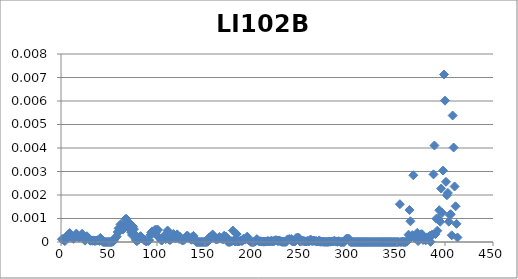
| Category |  LI102B |
|---|---|
| 0 | 0 |
| 1 | 0 |
| 2 | 0 |
| 3 | 0 |
| 4 | 0 |
| 5 | 0 |
| 6 | 0 |
| 7 | 0 |
| 8 | 0 |
| 9 | 0 |
| 10 | 0 |
| 11 | 0 |
| 12 | 0 |
| 13 | 0 |
| 14 | 0 |
| 15 | 0 |
| 16 | 0 |
| 17 | 0 |
| 18 | 0 |
| 19 | 0 |
| 20 | 0 |
| 21 | 0 |
| 22 | 0 |
| 23 | 0 |
| 24 | 0 |
| 25 | 0 |
| 26 | 0 |
| 27 | 0 |
| 28 | 0 |
| 29 | 0 |
| 30 | 0 |
| 31 | 0 |
| 32 | 0 |
| 33 | 0 |
| 34 | 0 |
| 35 | 0 |
| 36 | 0 |
| 37 | 0 |
| 38 | 0 |
| 39 | 0 |
| 40 | 0 |
| 41 | 0 |
| 42 | 0 |
| 43 | 0 |
| 44 | 0 |
| 45 | 0 |
| 46 | 0 |
| 47 | 0 |
| 48 | 0 |
| 49 | 0 |
| 50 | 0 |
| 51 | 0 |
| 52 | 0 |
| 53 | 0 |
| 54 | 0 |
| 55 | 0 |
| 56 | 0 |
| 57 | 0 |
| 58 | 0 |
| 59 | 0.001 |
| 60 | 0 |
| 61 | 0.001 |
| 62 | 0.001 |
| 63 | 0.001 |
| 64 | 0.001 |
| 65 | 0.001 |
| 66 | 0.001 |
| 67 | 0.001 |
| 68 | 0.001 |
| 69 | 0.001 |
| 70 | 0.001 |
| 71 | 0.001 |
| 72 | 0 |
| 73 | 0 |
| 74 | 0.001 |
| 75 | 0.001 |
| 76 | 0 |
| 77 | 0 |
| 78 | 0 |
| 79 | 0 |
| 80 | 0 |
| 81 | 0 |
| 82 | 0 |
| 83 | 0 |
| 84 | 0 |
| 85 | 0 |
| 86 | 0 |
| 87 | 0 |
| 88 | 0 |
| 89 | 0 |
| 90 | 0 |
| 91 | 0 |
| 92 | 0 |
| 93 | 0 |
| 94 | 0 |
| 95 | 0 |
| 96 | 0 |
| 97 | 0.001 |
| 98 | 0 |
| 99 | 0.001 |
| 100 | 0.001 |
| 101 | 0 |
| 102 | 0 |
| 103 | 0 |
| 104 | 0 |
| 105 | 0 |
| 106 | 0 |
| 107 | 0 |
| 108 | 0 |
| 109 | 0 |
| 110 | 0 |
| 111 | 0 |
| 112 | 0 |
| 113 | 0 |
| 114 | 0 |
| 115 | 0 |
| 116 | 0 |
| 117 | 0 |
| 118 | 0 |
| 119 | 0 |
| 120 | 0 |
| 121 | 0 |
| 122 | 0 |
| 123 | 0 |
| 124 | 0 |
| 125 | 0 |
| 126 | 0 |
| 127 | 0 |
| 128 | 0 |
| 129 | 0 |
| 130 | 0 |
| 131 | 0 |
| 132 | 0 |
| 133 | 0 |
| 134 | 0 |
| 135 | 0 |
| 136 | 0 |
| 137 | 0 |
| 138 | 0 |
| 139 | 0 |
| 140 | 0 |
| 141 | 0 |
| 142 | 0 |
| 143 | 0 |
| 144 | 0 |
| 145 | 0 |
| 146 | 0 |
| 147 | 0 |
| 148 | 0 |
| 149 | 0 |
| 150 | 0 |
| 151 | 0 |
| 152 | 0 |
| 153 | 0 |
| 154 | 0 |
| 155 | 0 |
| 156 | 0 |
| 157 | 0 |
| 158 | 0 |
| 159 | 0 |
| 160 | 0 |
| 161 | 0 |
| 162 | 0 |
| 163 | 0 |
| 164 | 0 |
| 165 | 0 |
| 166 | 0 |
| 167 | 0 |
| 168 | 0 |
| 169 | 0 |
| 170 | 0 |
| 171 | 0 |
| 172 | 0 |
| 173 | 0 |
| 174 | 0 |
| 175 | 0 |
| 176 | 0 |
| 177 | 0 |
| 178 | 0 |
| 179 | 0 |
| 180 | 0 |
| 181 | 0 |
| 182 | 0 |
| 183 | 0 |
| 184 | 0 |
| 185 | 0 |
| 186 | 0 |
| 187 | 0 |
| 188 | 0 |
| 189 | 0 |
| 190 | 0 |
| 191 | 0 |
| 192 | 0 |
| 193 | 0 |
| 194 | 0 |
| 195 | 0 |
| 196 | 0 |
| 197 | 0 |
| 198 | 0 |
| 199 | 0 |
| 200 | 0 |
| 201 | 0 |
| 202 | 0 |
| 203 | 0 |
| 204 | 0 |
| 205 | 0 |
| 206 | 0 |
| 207 | 0 |
| 208 | 0 |
| 209 | 0 |
| 210 | 0 |
| 211 | 0 |
| 212 | 0 |
| 213 | 0 |
| 214 | 0 |
| 215 | 0 |
| 216 | 0 |
| 217 | 0 |
| 218 | 0 |
| 219 | 0 |
| 220 | 0 |
| 221 | 0 |
| 222 | 0 |
| 223 | 0 |
| 224 | 0 |
| 225 | 0 |
| 226 | 0 |
| 227 | 0 |
| 228 | 0 |
| 229 | 0 |
| 230 | 0 |
| 231 | 0 |
| 232 | 0 |
| 233 | 0 |
| 234 | 0 |
| 235 | 0 |
| 236 | 0 |
| 237 | 0 |
| 238 | 0 |
| 239 | 0 |
| 240 | 0 |
| 241 | 0 |
| 242 | 0 |
| 243 | 0 |
| 244 | 0 |
| 245 | 0 |
| 246 | 0 |
| 247 | 0 |
| 248 | 0 |
| 249 | 0 |
| 250 | 0 |
| 251 | 0 |
| 252 | 0 |
| 253 | 0 |
| 254 | 0 |
| 255 | 0 |
| 256 | 0 |
| 257 | 0 |
| 258 | 0 |
| 259 | 0 |
| 260 | 0 |
| 261 | 0 |
| 262 | 0 |
| 263 | 0 |
| 264 | 0 |
| 265 | 0 |
| 266 | 0 |
| 267 | 0 |
| 268 | 0 |
| 269 | 0 |
| 270 | 0 |
| 271 | 0 |
| 272 | 0 |
| 273 | 0 |
| 274 | 0 |
| 275 | 0 |
| 276 | 0 |
| 277 | 0 |
| 278 | 0 |
| 279 | 0 |
| 280 | 0 |
| 281 | 0 |
| 282 | 0 |
| 283 | 0 |
| 284 | 0 |
| 285 | 0 |
| 286 | 0 |
| 287 | 0 |
| 288 | 0 |
| 289 | 0 |
| 290 | 0 |
| 291 | 0 |
| 292 | 0 |
| 293 | 0 |
| 294 | 0 |
| 295 | 0 |
| 296 | 0 |
| 297 | 0 |
| 298 | 0 |
| 299 | 0 |
| 300 | 0 |
| 301 | 0 |
| 302 | 0 |
| 303 | 0 |
| 304 | 0 |
| 305 | 0 |
| 306 | 0 |
| 307 | 0 |
| 308 | 0 |
| 309 | 0 |
| 310 | 0 |
| 311 | 0 |
| 312 | 0 |
| 313 | 0 |
| 314 | 0 |
| 315 | 0 |
| 316 | 0 |
| 317 | 0 |
| 318 | 0 |
| 319 | 0 |
| 320 | 0 |
| 321 | 0 |
| 322 | 0 |
| 323 | 0 |
| 324 | 0 |
| 325 | 0 |
| 326 | 0 |
| 327 | 0 |
| 328 | 0 |
| 329 | 0 |
| 330 | 0 |
| 331 | 0 |
| 332 | 0 |
| 333 | 0 |
| 334 | 0 |
| 335 | 0 |
| 336 | 0 |
| 337 | 0 |
| 338 | 0 |
| 339 | 0 |
| 340 | 0 |
| 341 | 0 |
| 342 | 0 |
| 343 | 0 |
| 344 | 0 |
| 345 | 0 |
| 346 | 0 |
| 347 | 0 |
| 348 | 0 |
| 349 | 0 |
| 350 | 0 |
| 351 | 0 |
| 352 | 0.002 |
| 353 | 0 |
| 354 | 0 |
| 355 | 0 |
| 356 | 0 |
| 357 | 0 |
| 358 | 0 |
| 359 | 0 |
| 360 | 0 |
| 361 | 0 |
| 362 | 0.001 |
| 363 | 0.001 |
| 364 | 0 |
| 365 | 0 |
| 366 | 0.003 |
| 367 | 0 |
| 368 | 0 |
| 369 | 0 |
| 370 | 0 |
| 371 | 0 |
| 372 | 0 |
| 373 | 0 |
| 374 | 0 |
| 375 | 0 |
| 376 | 0 |
| 377 | 0 |
| 378 | 0 |
| 379 | 0 |
| 380 | 0 |
| 381 | 0 |
| 382 | 0 |
| 383 | 0 |
| 384 | 0 |
| 385 | 0 |
| 386 | 0 |
| 387 | 0.003 |
| 388 | 0.004 |
| 389 | 0 |
| 390 | 0.001 |
| 391 | 0 |
| 392 | 0.001 |
| 393 | 0.001 |
| 394 | 0.001 |
| 395 | 0.002 |
| 396 | 0.001 |
| 397 | 0.003 |
| 398 | 0.007 |
| 399 | 0.006 |
| 400 | 0.003 |
| 401 | 0.002 |
| 402 | 0.002 |
| 403 | 0.001 |
| 404 | 0.001 |
| 405 | 0.001 |
| 406 | 0 |
| 407 | 0.005 |
| 408 | 0.004 |
| 409 | 0.002 |
| 410 | 0.002 |
| 411 | 0.001 |
| 412 | 0 |